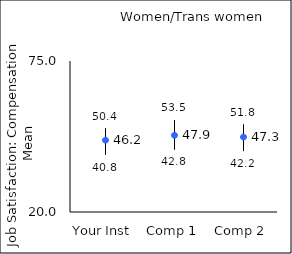
| Category | 25th percentile | 75th percentile | Mean |
|---|---|---|---|
| Your Inst | 40.8 | 50.4 | 46.16 |
| Comp 1 | 42.8 | 53.5 | 47.93 |
| Comp 2 | 42.2 | 51.8 | 47.29 |